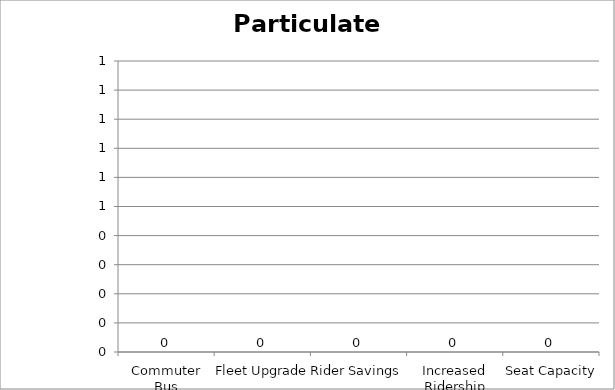
| Category | Particulate Matter |
|---|---|
| Commuter Bus | 0 |
| Fleet Upgrade | 0 |
| Rider Savings | 0 |
| Increased Ridership | 0 |
| Seat Capacity | 0 |